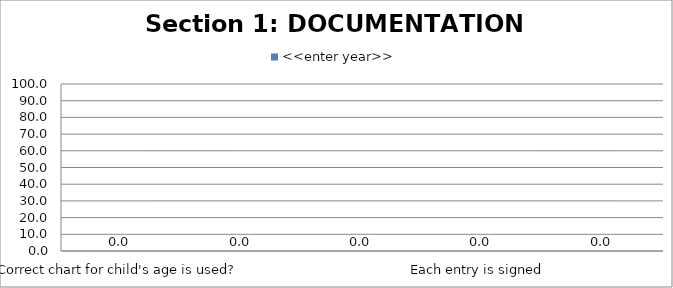
| Category | <<enter year>> |
|---|---|
| Correct chart for child's age is used? | 0 |
| 3 addressograph labels per chart | 0 |
| Date and time of each observation present and clear  | 0 |
| Each entry is signed  | 0 |
| Each entry has NMBI PIN | 0 |